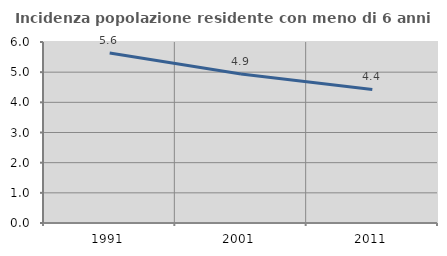
| Category | Incidenza popolazione residente con meno di 6 anni |
|---|---|
| 1991.0 | 5.633 |
| 2001.0 | 4.938 |
| 2011.0 | 4.427 |